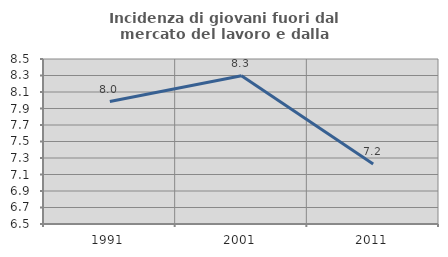
| Category | Incidenza di giovani fuori dal mercato del lavoro e dalla formazione  |
|---|---|
| 1991.0 | 7.985 |
| 2001.0 | 8.297 |
| 2011.0 | 7.227 |